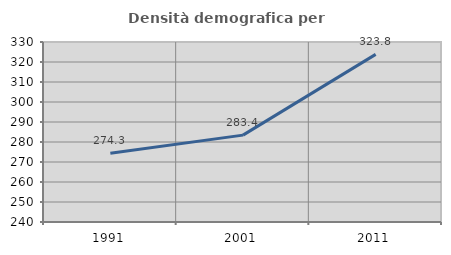
| Category | Densità demografica |
|---|---|
| 1991.0 | 274.342 |
| 2001.0 | 283.441 |
| 2011.0 | 323.827 |